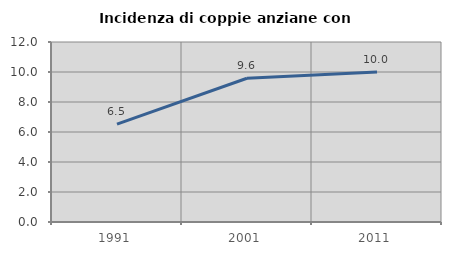
| Category | Incidenza di coppie anziane con figli |
|---|---|
| 1991.0 | 6.531 |
| 2001.0 | 9.583 |
| 2011.0 | 10 |